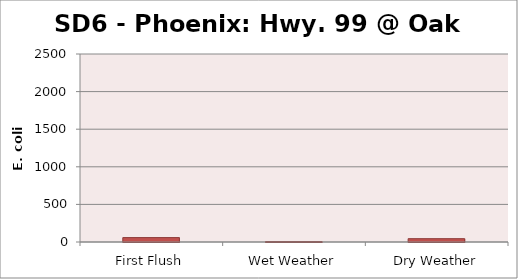
| Category | E. coli MPN |
|---|---|
| First Flush | 58.3 |
| Wet Weather | 5.2 |
| Dry Weather | 44.1 |